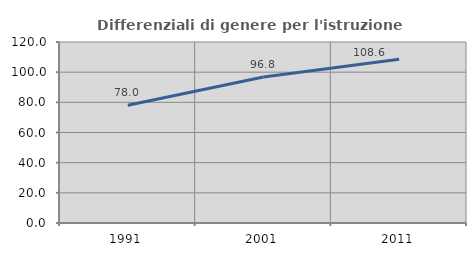
| Category | Differenziali di genere per l'istruzione superiore |
|---|---|
| 1991.0 | 78.021 |
| 2001.0 | 96.84 |
| 2011.0 | 108.597 |